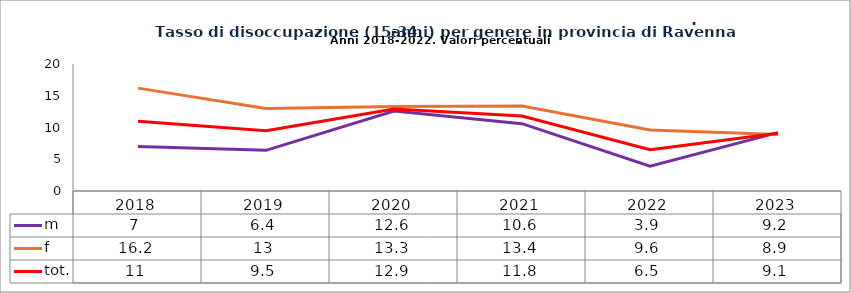
| Category | m | f | tot. |
|---|---|---|---|
| 2018.0 | 7 | 16.2 | 11 |
| 2019.0 | 6.4 | 13 | 9.5 |
| 2020.0 | 12.6 | 13.3 | 12.9 |
| 2021.0 | 10.6 | 13.4 | 11.8 |
| 2022.0 | 3.9 | 9.6 | 6.5 |
| 2023.0 | 9.2 | 8.9 | 9.1 |